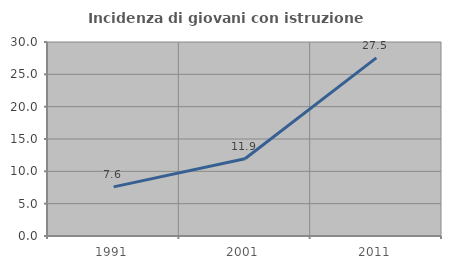
| Category | Incidenza di giovani con istruzione universitaria |
|---|---|
| 1991.0 | 7.599 |
| 2001.0 | 11.936 |
| 2011.0 | 27.536 |